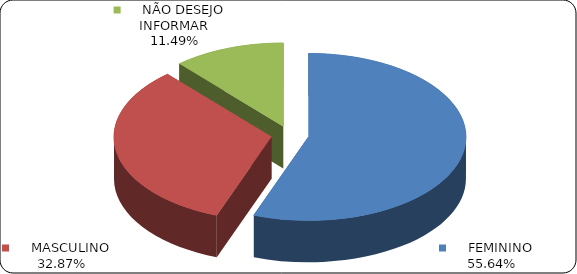
| Category | Series 0 |
|---|---|
|      FEMININO | 0.556 |
|      MASCULINO | 0.329 |
|      NÃO DESEJO INFORMAR | 0.115 |